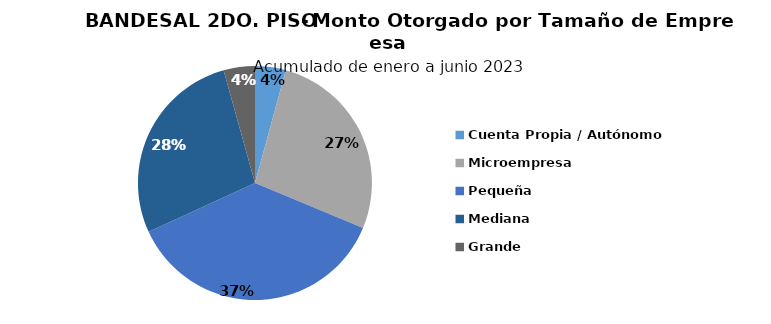
| Category | Monto |
|---|---|
| Cuenta Propia / Autónomo | 4.792 |
| Microempresa | 30.539 |
| Pequeña | 41.611 |
| Mediana | 31.07 |
| Grande | 4.889 |